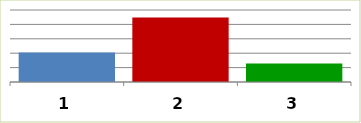
| Category | Series 0 |
|---|---|
| 0 | 102460073.987 |
| 1 | 224073619.367 |
| 2 | 63944476 |